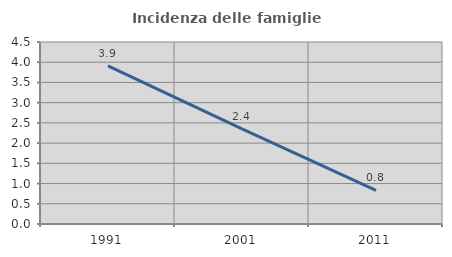
| Category | Incidenza delle famiglie numerose |
|---|---|
| 1991.0 | 3.909 |
| 2001.0 | 2.352 |
| 2011.0 | 0.829 |